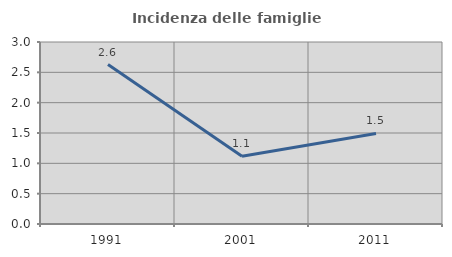
| Category | Incidenza delle famiglie numerose |
|---|---|
| 1991.0 | 2.628 |
| 2001.0 | 1.117 |
| 2011.0 | 1.493 |